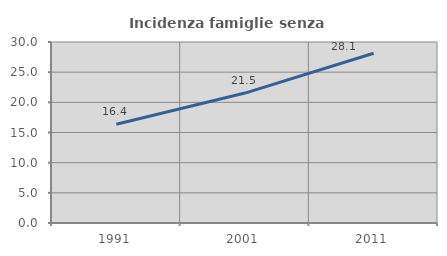
| Category | Incidenza famiglie senza nuclei |
|---|---|
| 1991.0 | 16.371 |
| 2001.0 | 21.535 |
| 2011.0 | 28.134 |